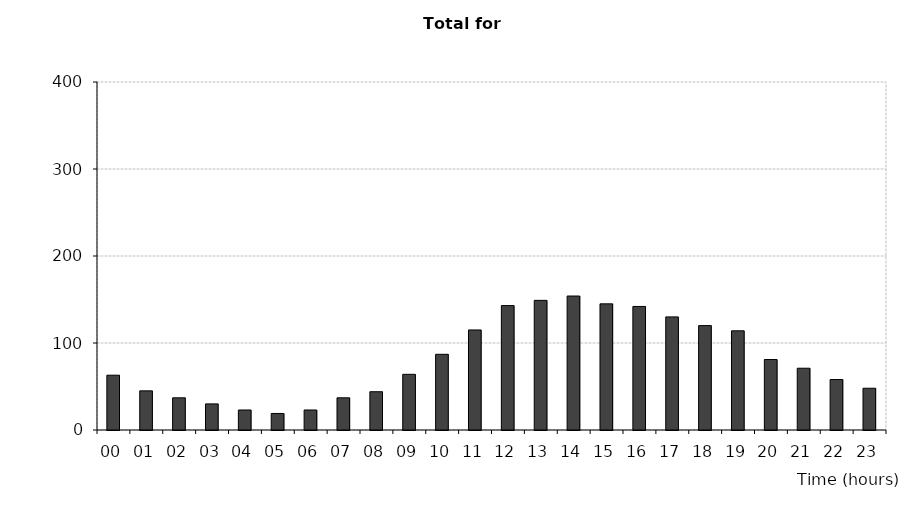
| Category | All severities |
|---|---|
| 00 | 63 |
| 01 | 45 |
| 02 | 37 |
| 03 | 30 |
| 04 | 23 |
| 05 | 19 |
| 06 | 23 |
| 07 | 37 |
| 08 | 44 |
| 09 | 64 |
| 10 | 87 |
| 11 | 115 |
| 12 | 143 |
| 13 | 149 |
| 14 | 154 |
| 15 | 145 |
| 16 | 142 |
| 17 | 130 |
| 18 | 120 |
| 19 | 114 |
| 20 | 81 |
| 21 | 71 |
| 22 | 58 |
| 23 | 48 |